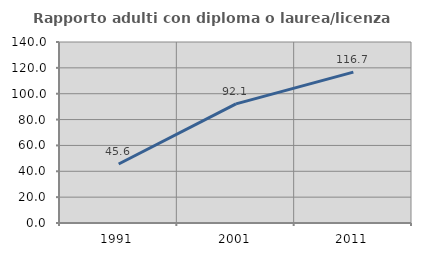
| Category | Rapporto adulti con diploma o laurea/licenza media  |
|---|---|
| 1991.0 | 45.614 |
| 2001.0 | 92.126 |
| 2011.0 | 116.667 |